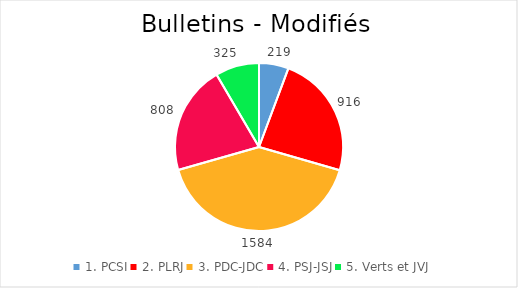
| Category | Series 0 |
|---|---|
| 1. PCSI | 219 |
| 2. PLRJ | 916 |
| 3. PDC-JDC | 1584 |
| 4. PSJ-JSJ | 808 |
| 5. Verts et JVJ | 325 |